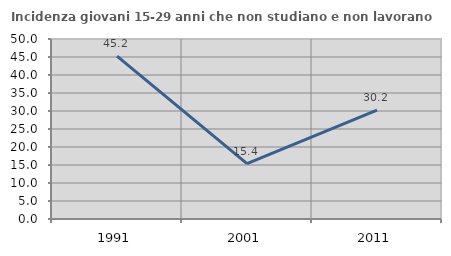
| Category | Incidenza giovani 15-29 anni che non studiano e non lavorano  |
|---|---|
| 1991.0 | 45.226 |
| 2001.0 | 15.385 |
| 2011.0 | 30.233 |